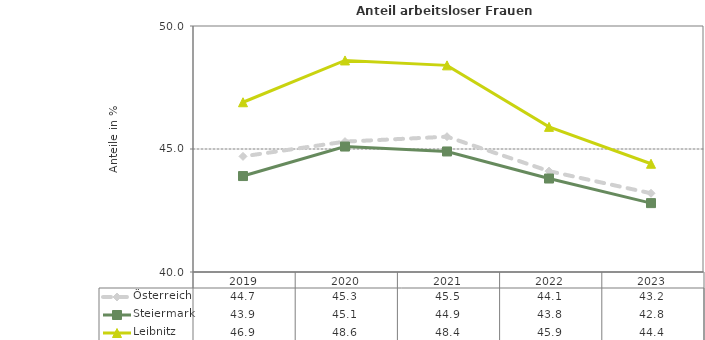
| Category | Österreich | Steiermark | Leibnitz |
|---|---|---|---|
| 2023.0 | 43.2 | 42.8 | 44.4 |
| 2022.0 | 44.1 | 43.8 | 45.9 |
| 2021.0 | 45.5 | 44.9 | 48.4 |
| 2020.0 | 45.3 | 45.1 | 48.6 |
| 2019.0 | 44.7 | 43.9 | 46.9 |